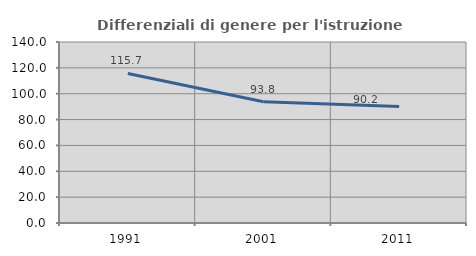
| Category | Differenziali di genere per l'istruzione superiore |
|---|---|
| 1991.0 | 115.701 |
| 2001.0 | 93.794 |
| 2011.0 | 90.169 |